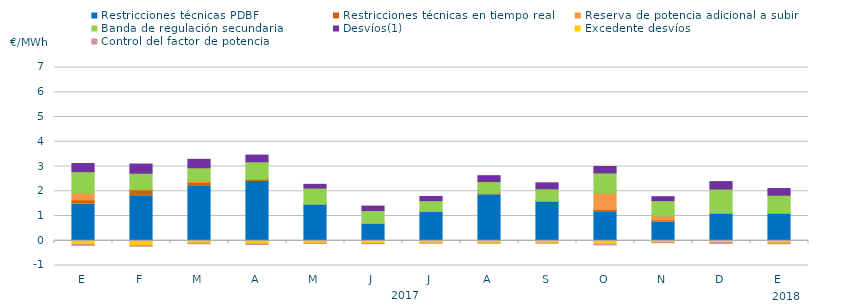
| Category | Restricciones técnicas PDBF | Restricciones técnicas en tiempo real | Reserva de potencia adicional a subir | Banda de regulación secundaria | Desvíos(1) | Excedente desvíos | Control del factor de potencia |
|---|---|---|---|---|---|---|---|
| E | 1.48 | 0.17 | 0.27 | 0.87 | 0.33 | -0.16 | -0.07 |
| F | 1.82 | 0.24 | 0.02 | 0.65 | 0.37 | -0.19 | -0.07 |
| M | 2.22 | 0.14 | 0.07 | 0.52 | 0.34 | -0.1 | -0.06 |
| A | 2.4 | 0.09 | 0.01 | 0.69 | 0.27 | -0.13 | -0.06 |
| M | 1.45 | 0.03 | 0 | 0.65 | 0.15 | -0.1 | -0.05 |
| J | 0.69 | 0.02 | 0.01 | 0.5 | 0.18 | -0.11 | -0.05 |
| J | 1.14 | 0.05 | 0 | 0.43 | 0.17 | -0.09 | -0.05 |
| A | 1.86 | 0.05 | 0.02 | 0.46 | 0.24 | -0.09 | -0.05 |
| S | 1.55 | 0.05 | 0.03 | 0.47 | 0.24 | -0.09 | -0.05 |
| O | 1.14 | 0.12 | 0.66 | 0.82 | 0.26 | -0.15 | -0.06 |
| N | 0.76 | 0.08 | 0.17 | 0.61 | 0.16 | -0.06 | -0.06 |
| D | 1.06 | 0.05 | 0.03 | 0.95 | 0.3 | -0.07 | -0.08 |
| E | 1.07 | 0.05 | 0.02 | 0.7 | 0.27 | -0.09 | -0.07 |